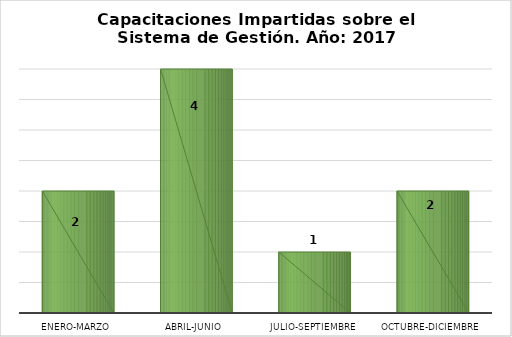
| Category | Capacitaciones impartidas |
|---|---|
| Enero-Marzo | 2 |
| Abril-Junio | 4 |
| Julio-Septiembre | 1 |
| Octubre-Diciembre | 2 |